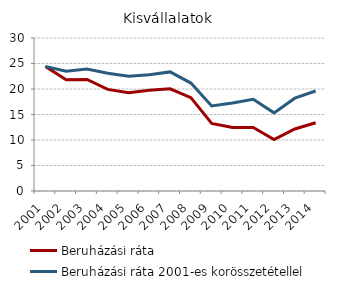
| Category | Beruházási ráta | Beruházási ráta 2001-es korösszetétellel |
|---|---|---|
| 2001.0 | 24.42 | 24.42 |
| 2002.0 | 21.802 | 23.503 |
| 2003.0 | 21.861 | 23.922 |
| 2004.0 | 19.922 | 23.091 |
| 2005.0 | 19.276 | 22.48 |
| 2006.0 | 19.772 | 22.777 |
| 2007.0 | 20.024 | 23.348 |
| 2008.0 | 18.305 | 21.164 |
| 2009.0 | 13.25 | 16.666 |
| 2010.0 | 12.447 | 17.258 |
| 2011.0 | 12.455 | 17.993 |
| 2012.0 | 10.103 | 15.322 |
| 2013.0 | 12.162 | 18.197 |
| 2014.0 | 13.38 | 19.601 |